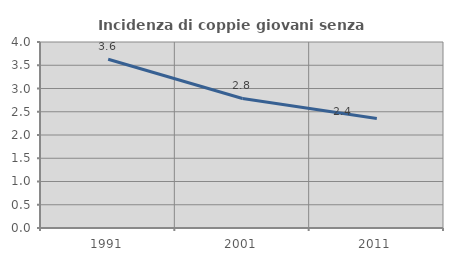
| Category | Incidenza di coppie giovani senza figli |
|---|---|
| 1991.0 | 3.629 |
| 2001.0 | 2.785 |
| 2011.0 | 2.354 |